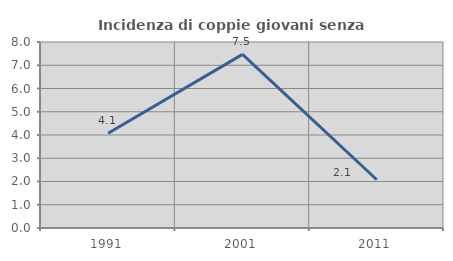
| Category | Incidenza di coppie giovani senza figli |
|---|---|
| 1991.0 | 4.074 |
| 2001.0 | 7.468 |
| 2011.0 | 2.076 |